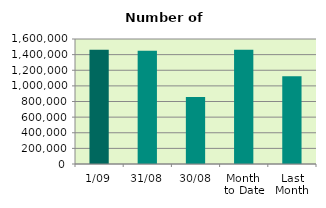
| Category | Series 0 |
|---|---|
| 1/09 | 1461322 |
| 31/08 | 1449962 |
| 30/08 | 857272 |
| Month 
to Date | 1461322 |
| Last
Month | 1124493.364 |